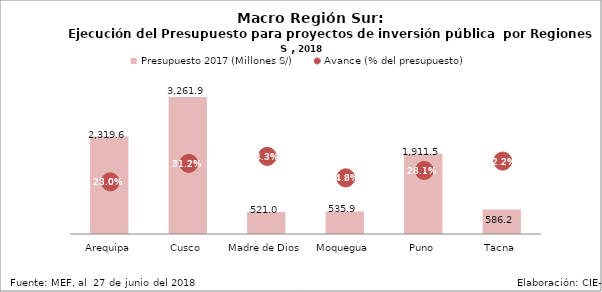
| Category | Presupuesto 2017 (Millones S/) |
|---|---|
| Arequipa | 2319.637 |
| Cusco | 3261.937 |
| Madre de Dios | 520.96 |
| Moquegua | 535.946 |
| Puno | 1911.544 |
| Tacna | 586.187 |